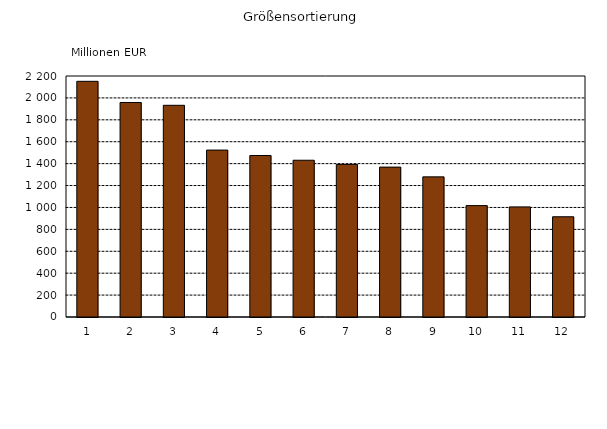
| Category | Series 0 |
|---|---|
| 1 | 2151.462 |
| 2 | 1958.132 |
| 3 | 1932.484 |
| 4 | 1523.902 |
| 5 | 1474.276 |
| 6 | 1430.953 |
| 7 | 1392.93 |
| 8 | 1368.408 |
| 9 | 1279.27 |
| 10 | 1016.922 |
| 11 | 1005.137 |
| 12 | 915.14 |